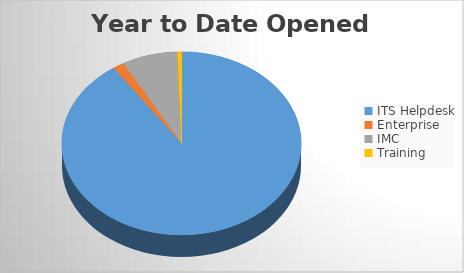
| Category | YTD Opened Tickets | 6M Opened |
|---|---|---|
| ITS Helpdesk | 2456 | 2456 |
| Enterprise | 42 | 42 |
| IMC | 204 | 204 |
| Training | 15 | 15 |